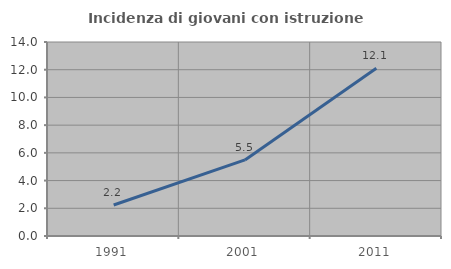
| Category | Incidenza di giovani con istruzione universitaria |
|---|---|
| 1991.0 | 2.239 |
| 2001.0 | 5.488 |
| 2011.0 | 12.102 |